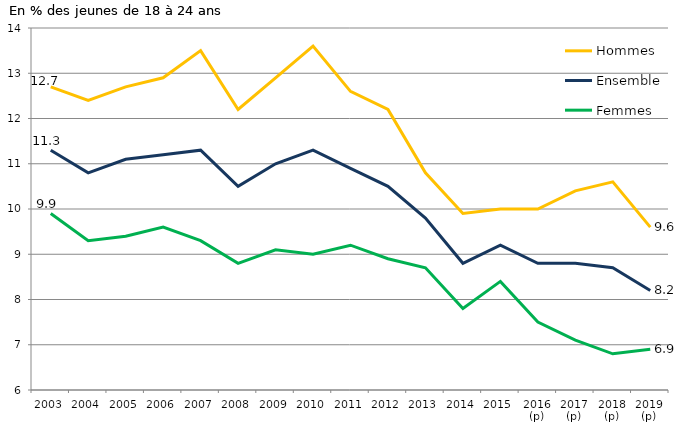
| Category | Hommes | Ensemble | Femmes |
|---|---|---|---|
| 2003 | 12.7 | 11.3 | 9.9 |
| 2004 | 12.4 | 10.8 | 9.3 |
| 2005 | 12.7 | 11.1 | 9.4 |
| 2006 | 12.9 | 11.2 | 9.6 |
| 2007 | 13.5 | 11.3 | 9.3 |
| 2008 | 12.2 | 10.5 | 8.8 |
| 2009 | 12.9 | 11 | 9.1 |
| 2010 | 13.6 | 11.3 | 9 |
| 2011 | 12.6 | 10.9 | 9.2 |
| 2012 | 12.2 | 10.5 | 8.9 |
| 2013 | 10.8 | 9.8 | 8.7 |
| 2014 | 9.9 | 8.8 | 7.8 |
| 2015 | 10 | 9.2 | 8.4 |
| 2016 (p) | 10 | 8.8 | 7.5 |
| 2017 (p) | 10.4 | 8.8 | 7.1 |
| 2018 (p) | 10.6 | 8.7 | 6.8 |
| 2019 (p) | 9.6 | 8.2 | 6.9 |